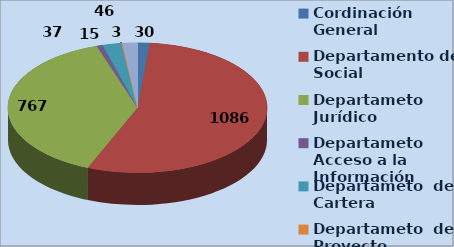
| Category | Series 0 | Series 1 |
|---|---|---|
| Cordinación General | 30 |  |
| Departamento de Social | 1086 |  |
| Departameto Jurídico  | 767 |  |
| Departameto Acceso a la Información  | 15 |  |
| Departameto  de Cartera | 46 |  |
| Departameto  de Proyecto | 3 |  |
| Departameto  de Catastro | 37 |  |